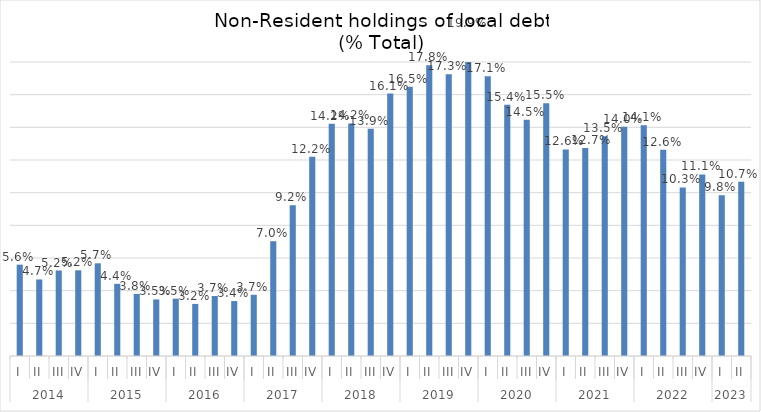
| Category | Local |
|---|---|
| 0 | 0.056 |
| 1 | 0.047 |
| 2 | 0.052 |
| 3 | 0.052 |
| 4 | 0.057 |
| 5 | 0.044 |
| 6 | 0.038 |
| 7 | 0.035 |
| 8 | 0.035 |
| 9 | 0.032 |
| 10 | 0.037 |
| 11 | 0.034 |
| 12 | 0.037 |
| 13 | 0.07 |
| 14 | 0.092 |
| 15 | 0.122 |
| 16 | 0.142 |
| 17 | 0.142 |
| 18 | 0.139 |
| 19 | 0.161 |
| 20 | 0.165 |
| 21 | 0.178 |
| 22 | 0.173 |
| 23 | 0.199 |
| 24 | 0.171 |
| 25 | 0.154 |
| 26 | 0.145 |
| 27 | 0.155 |
| 28 | 0.126 |
| 29 | 0.127 |
| 30 | 0.135 |
| 31 | 0.14 |
| 32 | 0.141 |
| 33 | 0.126 |
| 34 | 0.103 |
| 35 | 0.111 |
| 36 | 0.098 |
| 37 | 0.107 |